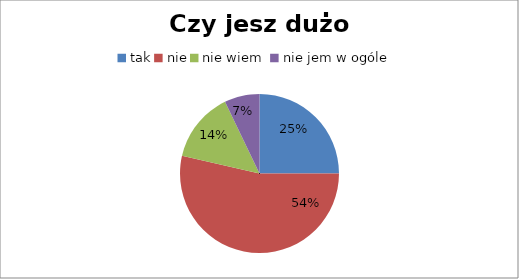
| Category | Czy jesz dużo słodyczy? |
|---|---|
| tak | 7 |
| nie | 15 |
| nie wiem  | 4 |
| nie jem w ogóle | 2 |